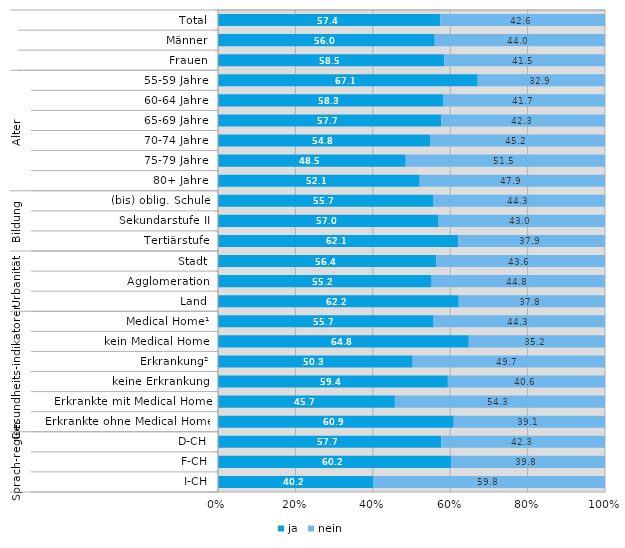
| Category | ja | nein |
|---|---|---|
| 0 | 57.4 | 42.6 |
| 1 | 56 | 44 |
| 2 | 58.5 | 41.5 |
| 3 | 67.1 | 32.9 |
| 4 | 58.3 | 41.7 |
| 5 | 57.7 | 42.3 |
| 6 | 54.8 | 45.2 |
| 7 | 48.5 | 51.5 |
| 8 | 52.1 | 47.9 |
| 9 | 55.7 | 44.3 |
| 10 | 57 | 43 |
| 11 | 62.1 | 37.9 |
| 12 | 56.4 | 43.6 |
| 13 | 55.2 | 44.8 |
| 14 | 62.2 | 37.8 |
| 15 | 55.7 | 44.3 |
| 16 | 64.8 | 35.2 |
| 17 | 50.3 | 49.7 |
| 18 | 59.4 | 40.6 |
| 19 | 45.7 | 54.3 |
| 20 | 60.9 | 39.1 |
| 21 | 57.7 | 42.3 |
| 22 | 60.2 | 39.8 |
| 23 | 40.2 | 59.8 |